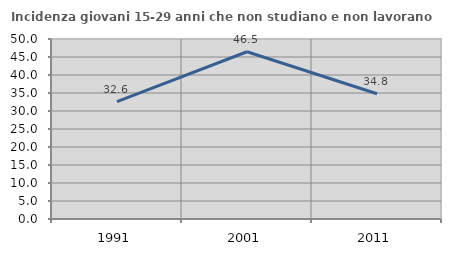
| Category | Incidenza giovani 15-29 anni che non studiano e non lavorano  |
|---|---|
| 1991.0 | 32.593 |
| 2001.0 | 46.46 |
| 2011.0 | 34.784 |